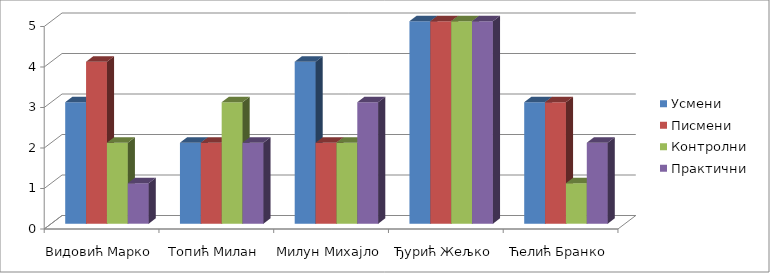
| Category | Усмени  | Писмени | Контролни  | Практични |
|---|---|---|---|---|
| Видовић Марко | 3 | 4 | 2 | 1 |
| Топић Милан | 2 | 2 | 3 | 2 |
| Милун Михајло | 4 | 2 | 2 | 3 |
| Ђурић Жељко | 5 | 5 | 5 | 5 |
| Ћелић Бранко | 3 | 3 | 1 | 2 |